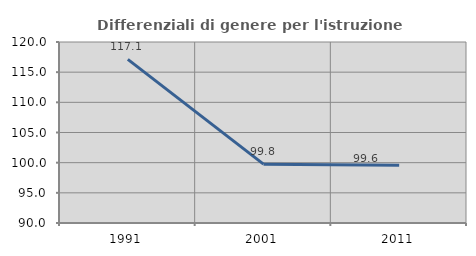
| Category | Differenziali di genere per l'istruzione superiore |
|---|---|
| 1991.0 | 117.12 |
| 2001.0 | 99.753 |
| 2011.0 | 99.563 |